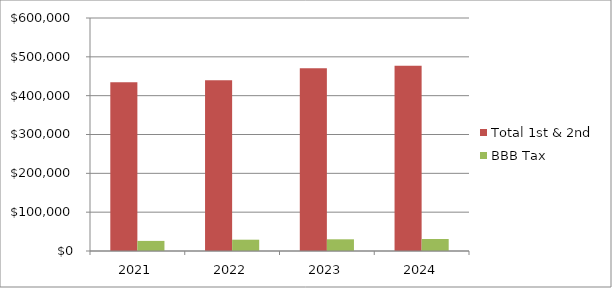
| Category | Total 1st & 2nd | BBB Tax |
|---|---|---|
| 2021.0 | 434825.7 | 25997.93 |
| 2022.0 | 439864.75 | 29106.71 |
| 2023.0 | 470769.83 | 30111.5 |
| 2024.0 | 476979.82 | 30932.21 |